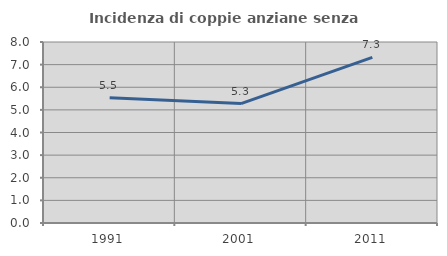
| Category | Incidenza di coppie anziane senza figli  |
|---|---|
| 1991.0 | 5.538 |
| 2001.0 | 5.278 |
| 2011.0 | 7.317 |